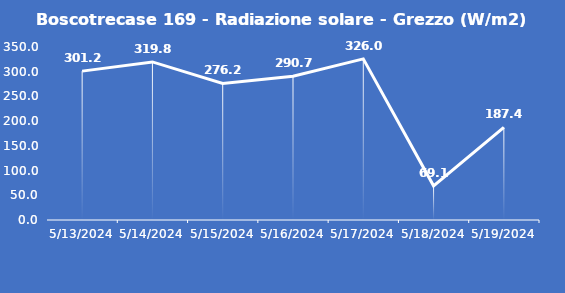
| Category | Boscotrecase 169 - Radiazione solare - Grezzo (W/m2) |
|---|---|
| 5/13/24 | 301.2 |
| 5/14/24 | 319.8 |
| 5/15/24 | 276.2 |
| 5/16/24 | 290.7 |
| 5/17/24 | 326 |
| 5/18/24 | 69.1 |
| 5/19/24 | 187.4 |